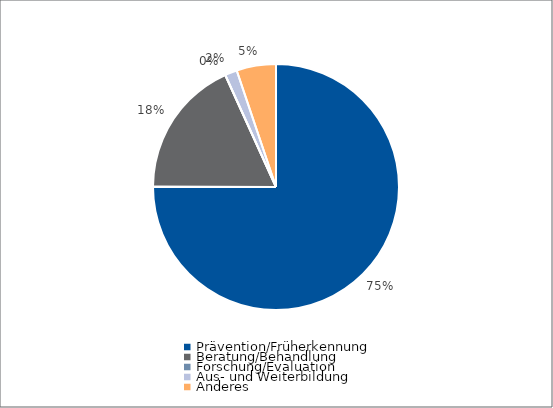
| Category | Series 0 |
|---|---|
| Prävention/Früherkennung | 11577.8 |
| Beratung/Behandlung | 2798.8 |
| Forschung/Evaluation | 0 |
| Aus- und Weiterbildung | 245.7 |
| Anderes | 798.7 |